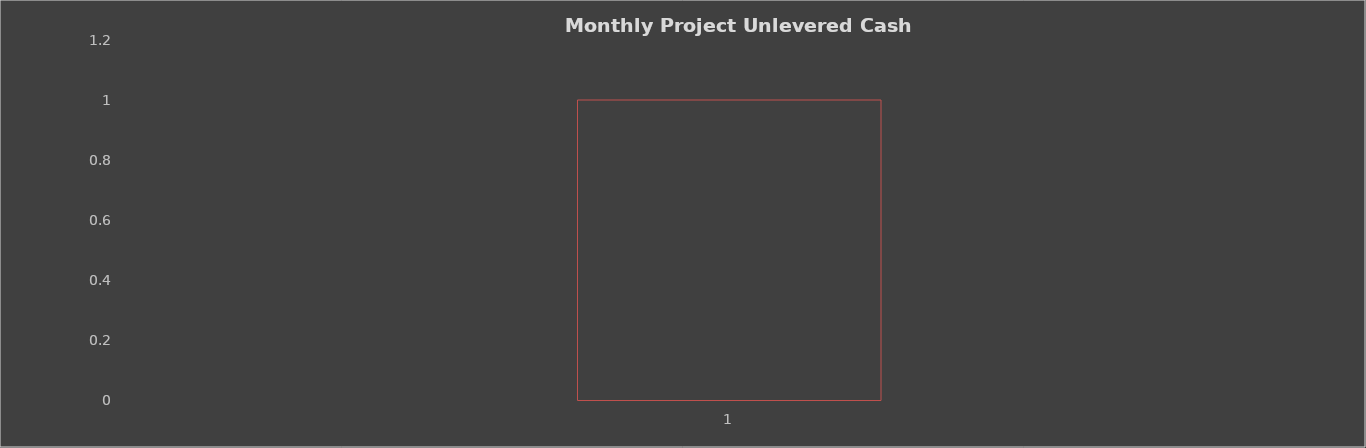
| Category | Unlevered Cash Flow |
|---|---|
| 0 | 1 |